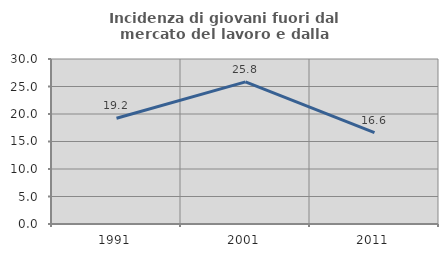
| Category | Incidenza di giovani fuori dal mercato del lavoro e dalla formazione  |
|---|---|
| 1991.0 | 19.225 |
| 2001.0 | 25.843 |
| 2011.0 | 16.607 |